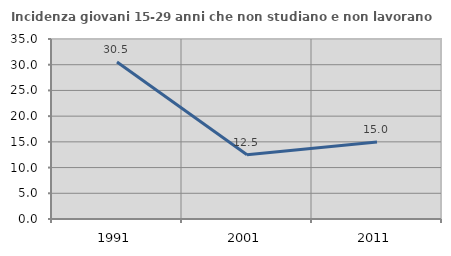
| Category | Incidenza giovani 15-29 anni che non studiano e non lavorano  |
|---|---|
| 1991.0 | 30.532 |
| 2001.0 | 12.5 |
| 2011.0 | 14.953 |